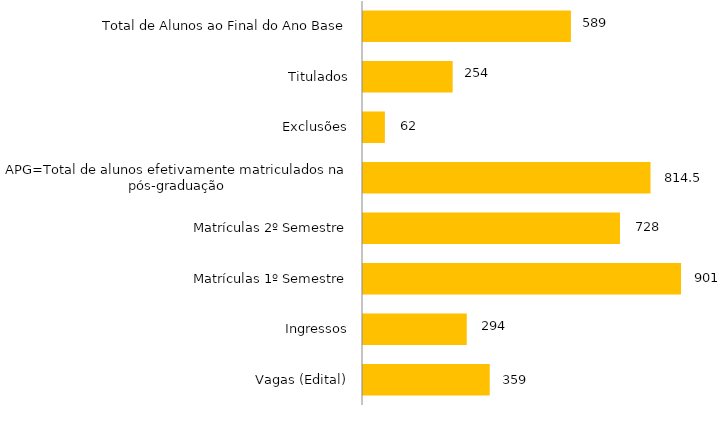
| Category | Curso |
|---|---|
| Vagas (Edital) | 359 |
| Ingressos | 294 |
| Matrículas 1º Semestre | 901 |
| Matrículas 2º Semestre | 728 |
| APG=Total de alunos efetivamente matriculados na pós-graduação | 814.5 |
| Exclusões | 62 |
| Titulados | 254 |
| Total de Alunos ao Final do Ano Base | 589 |